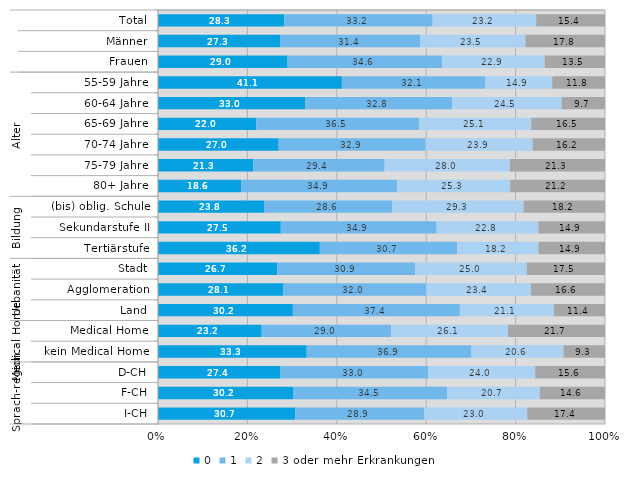
| Category | 0 | 1 | 2 | 3 oder mehr Erkrankungen |
|---|---|---|---|---|
| 0 | 28.3 | 33.2 | 23.2 | 15.4 |
| 1 | 27.3 | 31.4 | 23.5 | 17.8 |
| 2 | 29 | 34.6 | 22.9 | 13.5 |
| 3 | 41.1 | 32.1 | 14.9 | 11.8 |
| 4 | 33 | 32.8 | 24.5 | 9.7 |
| 5 | 22 | 36.5 | 25.1 | 16.5 |
| 6 | 27 | 32.9 | 23.9 | 16.2 |
| 7 | 21.3 | 29.4 | 28 | 21.3 |
| 8 | 18.6 | 34.9 | 25.3 | 21.2 |
| 9 | 23.8 | 28.6 | 29.3 | 18.2 |
| 10 | 27.5 | 34.9 | 22.8 | 14.9 |
| 11 | 36.2 | 30.7 | 18.2 | 14.9 |
| 12 | 26.7 | 30.9 | 25 | 17.5 |
| 13 | 28.1 | 32 | 23.4 | 16.6 |
| 14 | 30.2 | 37.4 | 21.1 | 11.4 |
| 15 | 23.2 | 29 | 26.1 | 21.7 |
| 16 | 33.3 | 36.9 | 20.6 | 9.3 |
| 17 | 27.4 | 33 | 24 | 15.6 |
| 18 | 30.2 | 34.5 | 20.7 | 14.6 |
| 19 | 30.7 | 28.9 | 23 | 17.4 |